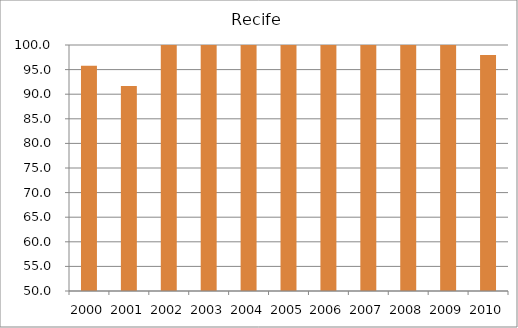
| Category | Recife |
|---|---|
| 2000.0 | 95.79 |
| 2001.0 | 91.65 |
| 2002.0 | 106.58 |
| 2003.0 | 116.14 |
| 2004.0 | 109.19 |
| 2005.0 | 105.9 |
| 2006.0 | 104.36 |
| 2007.0 | 108.49 |
| 2008.0 | 104.79 |
| 2009.0 | 105.63 |
| 2010.0 | 97.98 |